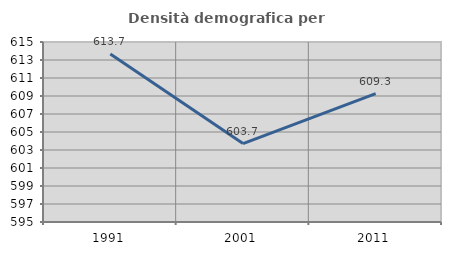
| Category | Densità demografica |
|---|---|
| 1991.0 | 613.654 |
| 2001.0 | 603.711 |
| 2011.0 | 609.259 |